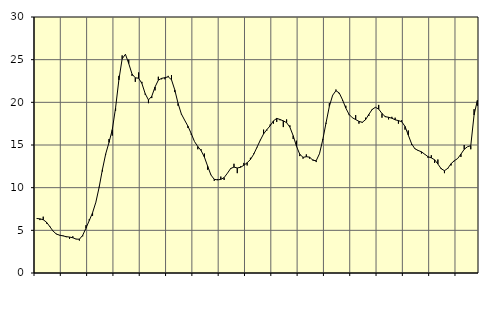
| Category | Piggar | Series 1 |
|---|---|---|
| nan | 6.4 | 6.39 |
| 87.0 | 6.2 | 6.35 |
| 87.0 | 6.6 | 6.24 |
| 87.0 | 5.8 | 5.96 |
| nan | 5.5 | 5.44 |
| 88.0 | 4.9 | 4.91 |
| 88.0 | 4.6 | 4.56 |
| 88.0 | 4.4 | 4.43 |
| nan | 4.4 | 4.35 |
| 89.0 | 4.2 | 4.26 |
| 89.0 | 4 | 4.21 |
| 89.0 | 4.3 | 4.13 |
| nan | 4 | 3.97 |
| 90.0 | 3.8 | 3.96 |
| 90.0 | 4.3 | 4.42 |
| 90.0 | 5.6 | 5.26 |
| nan | 6.3 | 6.15 |
| 91.0 | 6.7 | 7.06 |
| 91.0 | 8.3 | 8.29 |
| 91.0 | 10.1 | 10.04 |
| nan | 11.9 | 12.13 |
| 92.0 | 13.9 | 13.96 |
| 92.0 | 15.7 | 15.3 |
| 92.0 | 16.1 | 16.8 |
| nan | 19 | 19.35 |
| 93.0 | 23.1 | 22.62 |
| 93.0 | 25.5 | 25.1 |
| 93.0 | 25.6 | 25.63 |
| nan | 25 | 24.55 |
| 94.0 | 23.1 | 23.32 |
| 94.0 | 22.4 | 22.87 |
| 94.0 | 23.5 | 22.83 |
| nan | 22.4 | 22.22 |
| 95.0 | 20.9 | 21.02 |
| 95.0 | 19.9 | 20.28 |
| 95.0 | 20.5 | 20.71 |
| nan | 21.4 | 21.8 |
| 96.0 | 23 | 22.6 |
| 96.0 | 22.7 | 22.81 |
| 96.0 | 22.7 | 22.89 |
| nan | 23.1 | 22.99 |
| 97.0 | 23.2 | 22.65 |
| 97.0 | 21.2 | 21.46 |
| 97.0 | 19.6 | 19.87 |
| nan | 18.6 | 18.64 |
| 98.0 | 17.9 | 17.91 |
| 98.0 | 17 | 17.21 |
| 98.0 | 16.2 | 16.34 |
| nan | 15.4 | 15.4 |
| 99.0 | 14.5 | 14.82 |
| 99.0 | 14.5 | 14.35 |
| 99.0 | 14 | 13.59 |
| nan | 12.1 | 12.51 |
| 0.0 | 11.5 | 11.48 |
| 0.0 | 10.8 | 10.98 |
| 0.0 | 11 | 10.91 |
| nan | 11.3 | 10.97 |
| 1.0 | 10.9 | 11.18 |
| 1.0 | 11.7 | 11.69 |
| 1.0 | 12.2 | 12.25 |
| nan | 12.8 | 12.41 |
| 2.0 | 11.7 | 12.31 |
| 2.0 | 12.5 | 12.39 |
| 2.0 | 12.9 | 12.62 |
| nan | 12.6 | 12.92 |
| 3.0 | 13.5 | 13.3 |
| 3.0 | 14 | 13.92 |
| 3.0 | 14.7 | 14.74 |
| nan | 15.6 | 15.56 |
| 4.0 | 16.8 | 16.3 |
| 4.0 | 16.7 | 16.8 |
| 4.0 | 17.4 | 17.25 |
| nan | 17.5 | 17.83 |
| 5.0 | 17.7 | 18.12 |
| 5.0 | 17.9 | 17.99 |
| 5.0 | 17.1 | 17.83 |
| nan | 18 | 17.62 |
| 6.0 | 17.3 | 17.09 |
| 6.0 | 15.7 | 16.09 |
| 6.0 | 15.5 | 14.86 |
| nan | 13.7 | 13.92 |
| 7.0 | 13.4 | 13.55 |
| 7.0 | 13.9 | 13.63 |
| 7.0 | 13.4 | 13.57 |
| nan | 13.3 | 13.21 |
| 8.0 | 13 | 13.16 |
| 8.0 | 14 | 13.98 |
| 8.0 | 15.7 | 15.62 |
| nan | 17.5 | 17.61 |
| 9.0 | 19.9 | 19.53 |
| 9.0 | 20.8 | 20.83 |
| 9.0 | 21.5 | 21.36 |
| nan | 21 | 21.1 |
| 10.0 | 20.2 | 20.3 |
| 10.0 | 19.6 | 19.33 |
| 10.0 | 18.5 | 18.58 |
| nan | 18.2 | 18.19 |
| 11.0 | 18.5 | 17.98 |
| 11.0 | 17.5 | 17.77 |
| 11.0 | 17.6 | 17.66 |
| nan | 18.2 | 17.96 |
| 12.0 | 18.4 | 18.58 |
| 12.0 | 19.1 | 19.16 |
| 12.0 | 19.4 | 19.42 |
| nan | 19.7 | 19.21 |
| 13.0 | 18.2 | 18.69 |
| 13.0 | 18.4 | 18.32 |
| 13.0 | 18 | 18.25 |
| nan | 18.3 | 18.14 |
| 14.0 | 18.2 | 17.95 |
| 14.0 | 17.5 | 17.86 |
| 14.0 | 17.9 | 17.73 |
| nan | 16.8 | 17.18 |
| 15.0 | 16.7 | 16.16 |
| 15.0 | 15 | 15.15 |
| 15.0 | 14.6 | 14.56 |
| nan | 14.3 | 14.36 |
| 16.0 | 14 | 14.2 |
| 16.0 | 13.9 | 13.92 |
| 16.0 | 13.5 | 13.63 |
| nan | 13.8 | 13.49 |
| 17.0 | 12.9 | 13.27 |
| 17.0 | 13.3 | 12.77 |
| 17.0 | 12.3 | 12.22 |
| nan | 11.7 | 11.99 |
| 18.0 | 12.2 | 12.26 |
| 18.0 | 12.6 | 12.81 |
| 18.0 | 13.1 | 13.16 |
| nan | 13.4 | 13.41 |
| 19.0 | 13.6 | 13.93 |
| 19.0 | 15 | 14.49 |
| 19.0 | 14.8 | 14.8 |
| nan | 14.5 | 14.92 |
| 20.0 | 19.2 | 18.52 |
| 20.0 | 19.6 | 20.23 |